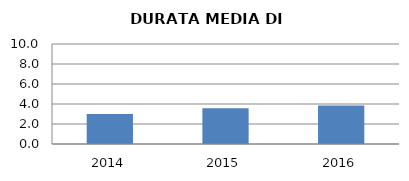
| Category | 2014 2015 2016 |
|---|---|
| 2014.0 | 3 |
| 2015.0 | 3.571 |
| 2016.0 | 3.842 |